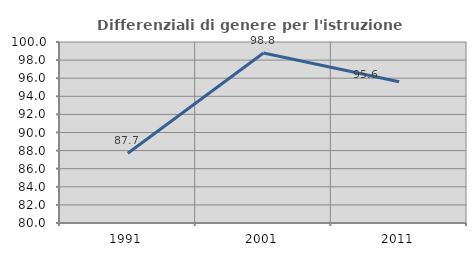
| Category | Differenziali di genere per l'istruzione superiore |
|---|---|
| 1991.0 | 87.714 |
| 2001.0 | 98.792 |
| 2011.0 | 95.608 |